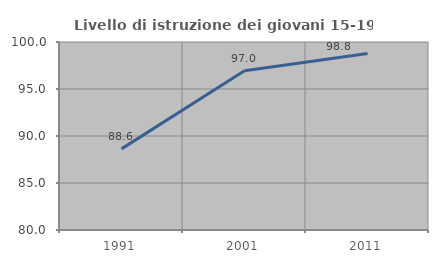
| Category | Livello di istruzione dei giovani 15-19 anni |
|---|---|
| 1991.0 | 88.629 |
| 2001.0 | 96.953 |
| 2011.0 | 98.772 |